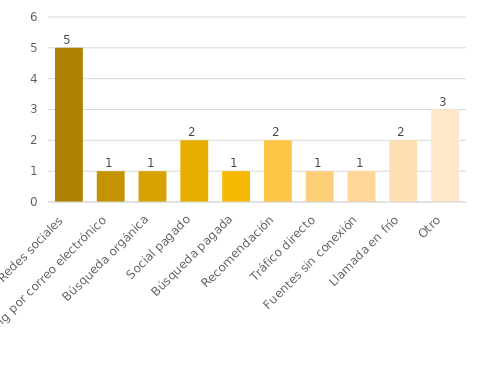
| Category | Series 0 |
|---|---|
| Redes sociales | 5 |
| Marketing por correo electrónico | 1 |
| Búsqueda orgánica | 1 |
| Social pagado | 2 |
| Búsqueda pagada | 1 |
| Recomendación | 2 |
| Tráfico directo | 1 |
| Fuentes sin conexión | 1 |
| Llamada en frío | 2 |
| Otro | 3 |